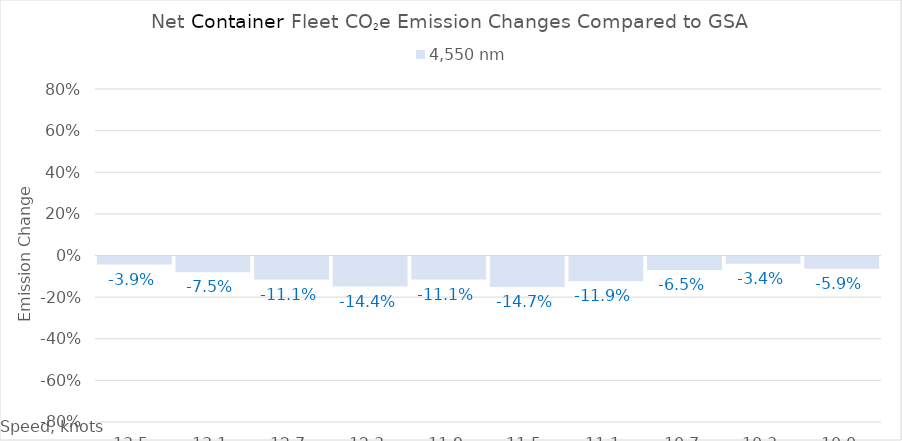
| Category | 4,550 |
|---|---|
| 13.5 | -0.039 |
| 13.1 | -0.075 |
| 12.7 | -0.111 |
| 12.299999999999999 | -0.144 |
| 11.899999999999999 | -0.111 |
| 11.499999999999998 | -0.147 |
| 11.099999999999998 | -0.119 |
| 10.699999999999998 | -0.065 |
| 10.299999999999997 | -0.034 |
| 10.0 | -0.059 |